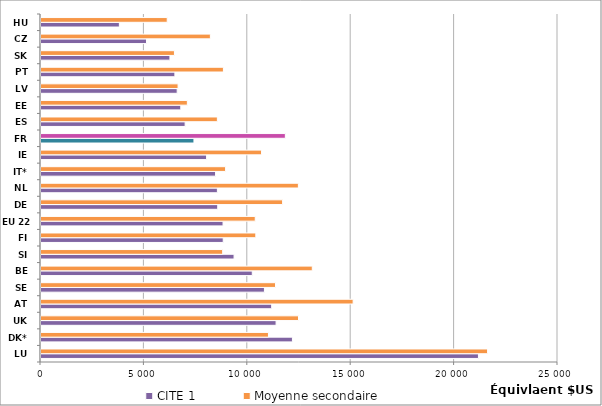
| Category | CITE 1 | Moyenne secondaire |
|---|---|---|
| LU | 21152.76 | 21595.267 |
| DK* | 12158.081 | 10998.356 |
| UK | 11367.416 | 12451.663 |
| AT | 11154.486 | 15094.11 |
| SE | 10804.312 | 11341.719 |
| BE | 10216.37 | 13118.368 |
| SI | 9335.47 | 8785.286 |
| FI | 8811.806 | 10387.478 |
| EU 22 | 8802.868 | 10360.356 |
| DE | 8545.92 | 11683.75 |
| NL | 8529.228 | 12446.04 |
| IT* | 8441.864 | 8926.874 |
| IE | 8006.795 | 10665.142 |
| FR | 7396.081 | 11815.494 |
| ES | 6969.735 | 8528.339 |
| EE | 6759.774 | 7077.216 |
| LV | 6585.167 | 6628.678 |
| PT | 6473.84 | 8820.674 |
| SK | 6234.522 | 6453.187 |
| CZ | 5100.848 | 8190.922 |
| HU | 3789.355 | 6103.809 |